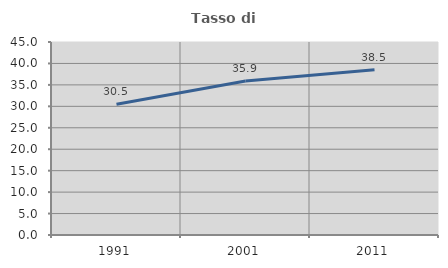
| Category | Tasso di occupazione   |
|---|---|
| 1991.0 | 30.471 |
| 2001.0 | 35.89 |
| 2011.0 | 38.536 |